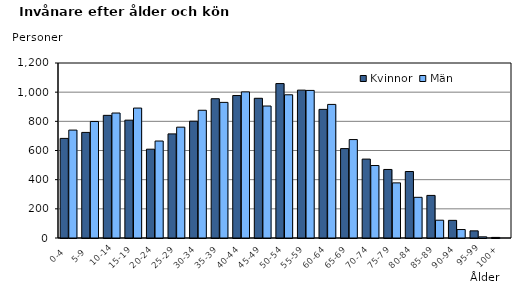
| Category | Kvinnor | Män |
|---|---|---|
|   0-4  | 683 | 740 |
|   5-9  | 724 | 799 |
| 10-14 | 841 | 857 |
| 15-19  | 808 | 891 |
| 20-24  | 609 | 665 |
| 25-29  | 714 | 760 |
| 30-34  | 801 | 876 |
| 35-39  | 955 | 930 |
| 40-44  | 977 | 1002 |
| 45-49  | 958 | 905 |
| 50-54  | 1059 | 982 |
| 55-59  | 1014 | 1012 |
| 60-64  | 882 | 916 |
| 65-69  | 613 | 675 |
| 70-74  | 541 | 497 |
| 75-79  | 470 | 378 |
| 80-84  | 456 | 279 |
| 85-89  | 292 | 122 |
| 90-94  | 121 | 58 |
| 95-99 | 49 | 8 |
| 100+ | 4 | 0 |